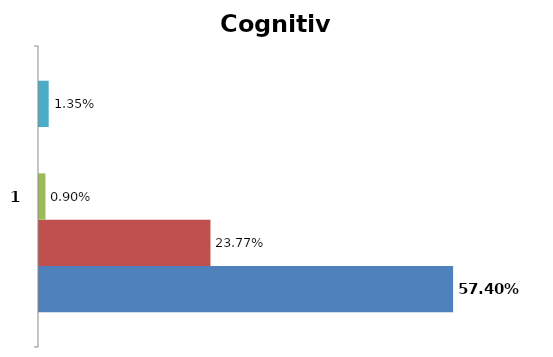
| Category | Alto | Mediano | Bajo | Ninguno | No sabe |
|---|---|---|---|---|---|
| 0 | 0.574 | 0.238 | 0.009 | 0 | 0.013 |